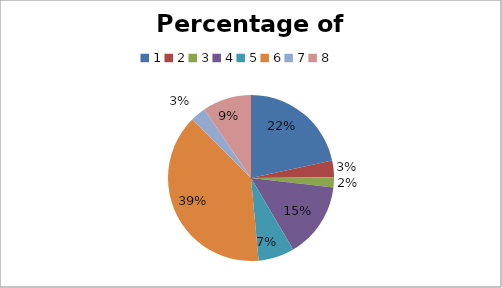
| Category | Series 0 |
|---|---|
| 0 | 0.216 |
| 1 | 0.032 |
| 2 | 0.019 |
| 3 | 0.147 |
| 4 | 0.07 |
| 5 | 0.389 |
| 6 | 0.03 |
| 7 | 0.095 |